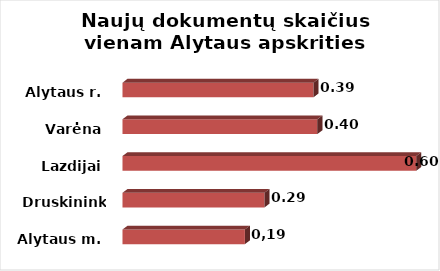
| Category | Series 0 |
|---|---|
| Alytaus m. | 0.25 |
| Druskininkai | 0.29 |
| Lazdijai | 0.6 |
| Varėna | 0.398 |
| Alytaus r. | 0.39 |